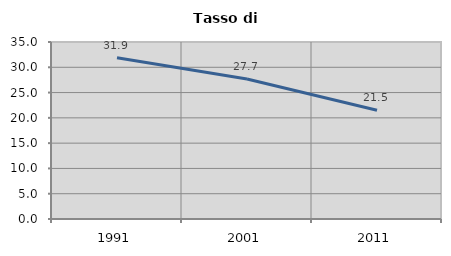
| Category | Tasso di disoccupazione   |
|---|---|
| 1991.0 | 31.896 |
| 2001.0 | 27.676 |
| 2011.0 | 21.493 |